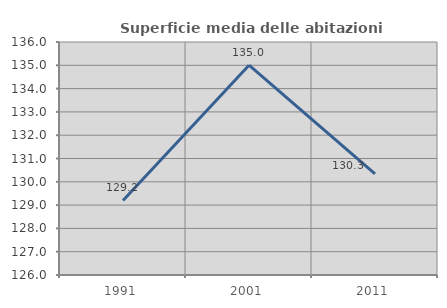
| Category | Superficie media delle abitazioni occupate |
|---|---|
| 1991.0 | 129.198 |
| 2001.0 | 135.003 |
| 2011.0 | 130.343 |